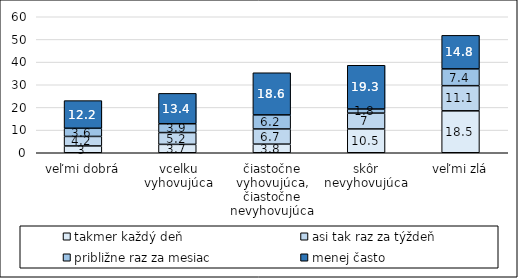
| Category | takmer každý deň | asi tak raz za týždeň | približne raz za mesiac | menej často |
|---|---|---|---|---|
| veľmi dobrá | 3 | 4.2 | 3.6 | 12.2 |
| vcelku vyhovujúca | 3.7 | 5.2 | 3.9 | 13.4 |
| čiastočne vyhovujúca, čiastočne nevyhovujúca | 3.8 | 6.7 | 6.2 | 18.6 |
| skôr nevyhovujúca | 10.5 | 7 | 1.8 | 19.3 |
| veľmi zlá | 18.5 | 11.1 | 7.4 | 14.8 |